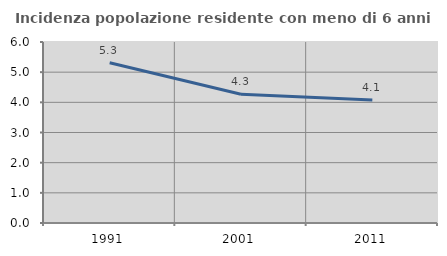
| Category | Incidenza popolazione residente con meno di 6 anni |
|---|---|
| 1991.0 | 5.312 |
| 2001.0 | 4.268 |
| 2011.0 | 4.075 |